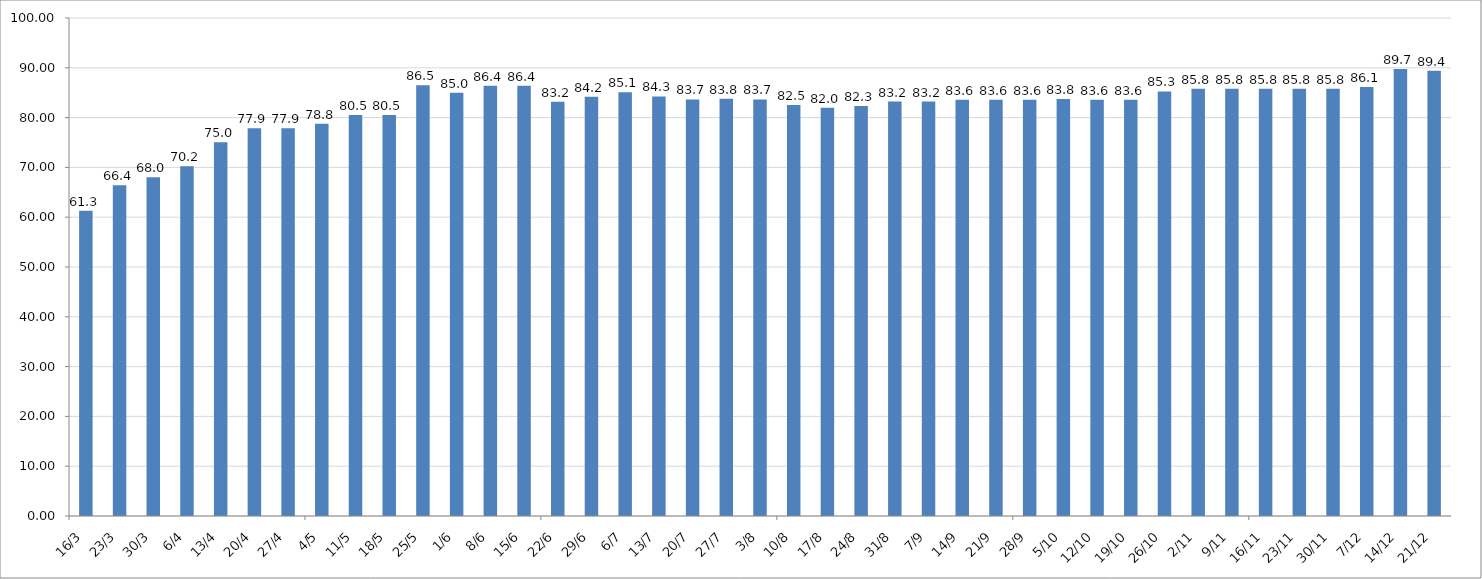
| Category | Series 0 |
|---|---|
| 2020-03-16 | 61.32 |
| 2020-03-23 | 66.42 |
| 2020-03-30 | 68.04 |
| 2020-04-06 | 70.24 |
| 2020-04-13 | 75.04 |
| 2020-04-20 | 77.85 |
| 2020-04-27 | 77.85 |
| 2020-05-04 | 78.75 |
| 2020-05-11 | 80.5 |
| 2020-05-18 | 80.5 |
| 2020-05-25 | 86.5 |
| 2020-06-01 | 84.983 |
| 2020-06-08 | 86.417 |
| 2020-06-15 | 86.417 |
| 2020-06-22 | 83.167 |
| 2020-06-29 | 84.167 |
| 2020-07-06 | 85.083 |
| 2020-07-13 | 84.25 |
| 2020-07-20 | 83.658 |
| 2020-07-27 | 83.792 |
| 2020-08-03 | 83.658 |
| 2020-08-10 | 82.542 |
| 2020-08-17 | 81.975 |
| 2020-08-24 | 82.333 |
| 2020-08-31 | 83.208 |
| 2020-09-07 | 83.208 |
| 2020-09-14 | 83.583 |
| 2020-09-21 | 83.583 |
| 2020-09-28 | 83.583 |
| 2020-10-05 | 83.75 |
| 2020-10-12 | 83.583 |
| 2020-10-19 | 83.583 |
| 2020-10-26 | 85.25 |
| 2020-11-02 | 85.8 |
| 2020-11-09 | 85.8 |
| 2020-11-16 | 85.8 |
| 2020-11-23 | 85.8 |
| 2020-11-30 | 85.8 |
| 2020-12-07 | 86.133 |
| 2020-12-14 | 89.742 |
| 2020-12-21 | 89.408 |